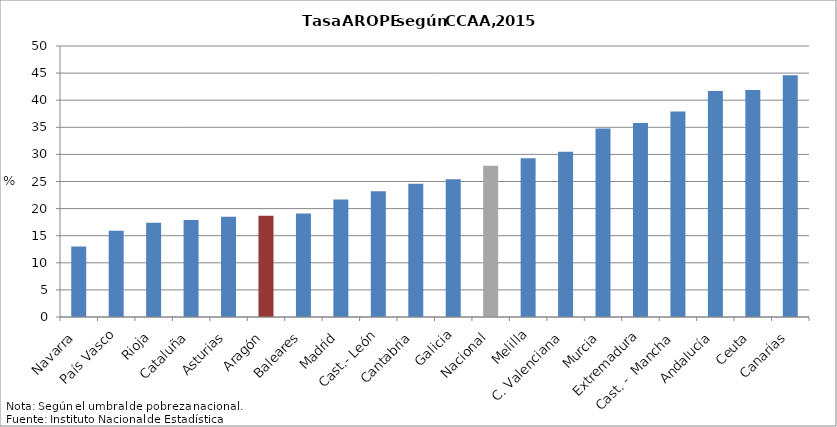
| Category | Series 0 |
|---|---|
| Navarra | 13 |
| País Vasco | 15.9 |
| Rioja | 17.4 |
| Cataluña | 17.9 |
| Asturias | 18.5 |
| Aragón | 18.7 |
| Baleares | 19.1 |
| Madrid | 21.7 |
| Cast.- León | 23.2 |
| Cantabria | 24.6 |
| Galicia | 25.4 |
| Nacional | 27.9 |
| Melilla | 29.3 |
| C. Valenciana | 30.5 |
| Murcia | 34.8 |
| Extremadura | 35.8 |
| Cast. -  Mancha | 37.9 |
| Andalucía | 41.7 |
| Ceuta | 41.9 |
| Canarias | 44.6 |